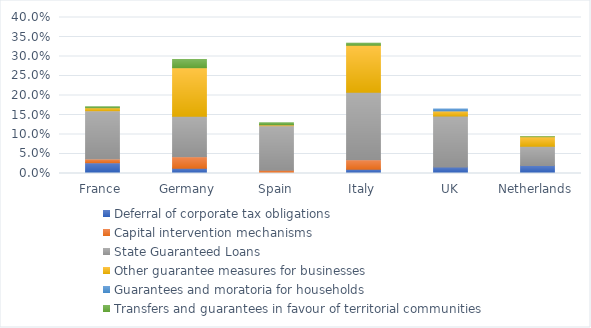
| Category | Deferral of corporate tax obligations | Capital intervention mechanisms | State Guaranteed Loans | Other guarantee measures for businesses | Guarantees and moratoria for households | Transfers and guarantees in favour of territorial communities |
|---|---|---|---|---|---|---|
| France  | 0.027 | 0.01 | 0.124 | 0.007 | 0 | 0.003 |
| Germany | 0.013 | 0.03 | 0.104 | 0.125 | 0 | 0.021 |
| Spain | 0.001 | 0.008 | 0.114 | 0.002 | 0.001 | 0.004 |
| Italy | 0.011 | 0.025 | 0.173 | 0.12 | 0 | 0.005 |
| UK | 0.017 | 0 | 0.131 | 0.013 | 0.005 | 0 |
| Netherlands | 0.02 | 0 | 0.049 | 0.025 | 0 | 0 |